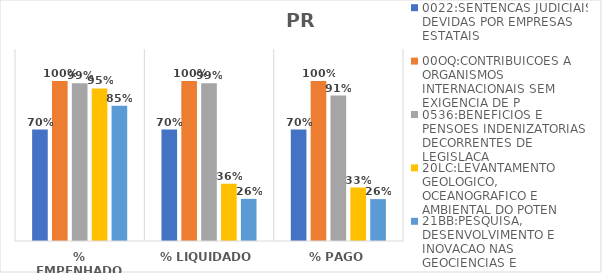
| Category | 0022:SENTENCAS JUDICIAIS DEVIDAS POR EMPRESAS ESTATAIS | 00OQ:CONTRIBUICOES A ORGANISMOS INTERNACIONAIS SEM EXIGENCIA DE P | 0536:BENEFICIOS E PENSOES INDENIZATORIAS DECORRENTES DE LEGISLACA | 20LC:LEVANTAMENTO GEOLOGICO, OCEANOGRAFICO E AMBIENTAL DO POTEN | 21BB:PESQUISA, DESENVOLVIMENTO E INOVACAO NAS GEOCIENCIAS E |
|---|---|---|---|---|---|
| % EMPENHADO | 0.697 | 1 | 0.985 | 0.953 | 0.846 |
| % LIQUIDADO | 0.697 | 1 | 0.985 | 0.358 | 0.263 |
| % PAGO | 0.697 | 1 | 0.909 | 0.334 | 0.262 |